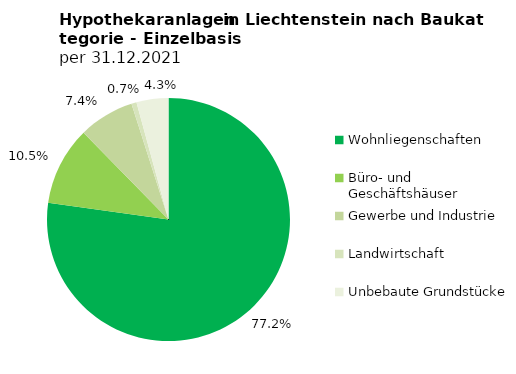
| Category | Series 0 |
|---|---|
| Wohnliegenschaften | 5725367 |
| Büro- und Geschäftshäuser | 777948 |
| Gewerbe und Industrie | 548444 |
| Landwirtschaft | 50185 |
| Unbebaute Grundstücke | 315287 |